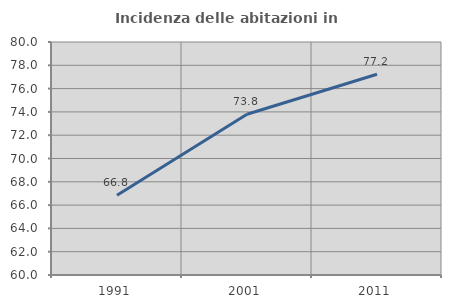
| Category | Incidenza delle abitazioni in proprietà  |
|---|---|
| 1991.0 | 66.842 |
| 2001.0 | 73.799 |
| 2011.0 | 77.237 |